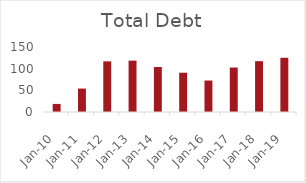
| Category | Total Debt(D) |
|---|---|
| 2010-03-31 | 18.64 |
| 2011-03-31 | 54.03 |
| 2012-03-31 | 116.85 |
| 2013-03-31 | 118.5 |
| 2014-03-31 | 103.88 |
| 2015-03-31 | 90.65 |
| 2016-03-31 | 72.62 |
| 2017-03-31 | 102.62 |
| 2018-03-31 | 117.32 |
| 2019-03-31 | 125.11 |